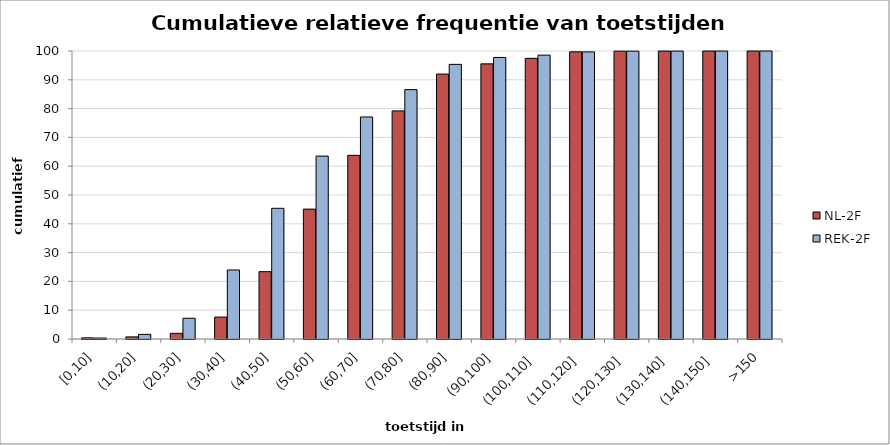
| Category | NL-2F | REK-2F |
|---|---|---|
| [0,10] | 0.397 | 0.341 |
| (10,20] | 0.732 | 1.604 |
| (20,30] | 1.968 | 7.21 |
| (30,40] | 7.607 | 23.968 |
| (40,50] | 23.382 | 45.378 |
| (50,60] | 45.096 | 63.506 |
| (60,70] | 63.764 | 77.094 |
| (70,80] | 79.205 | 86.595 |
| (80,90] | 91.996 | 95.357 |
| (90,100] | 95.53 | 97.76 |
| (100,110] | 97.447 | 98.555 |
| (110,120] | 99.705 | 99.696 |
| (120,130] | 99.949 | 99.949 |
| (130,140] | 99.977 | 99.972 |
| (140,150] | 100 | 99.986 |
| >150 | 100 | 100 |